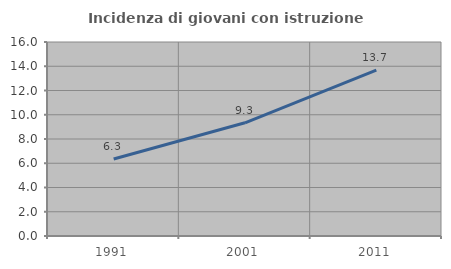
| Category | Incidenza di giovani con istruzione universitaria |
|---|---|
| 1991.0 | 6.346 |
| 2001.0 | 9.335 |
| 2011.0 | 13.684 |